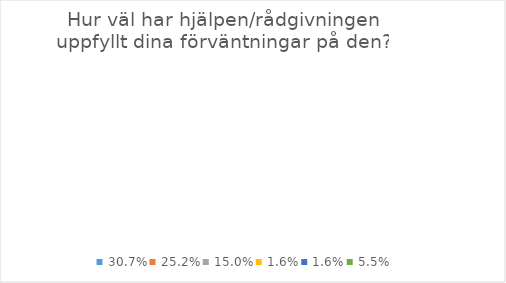
| Category | Series 0 |
|---|---|
| 0.30708661417322836 | 0 |
| 0.25196850393700787 | 0 |
| 0.14960629921259844 | 0 |
| 0.015748031496062992 | 0 |
| 0.015748031496062992 | 0 |
| 0.05511811023622047 | 0 |